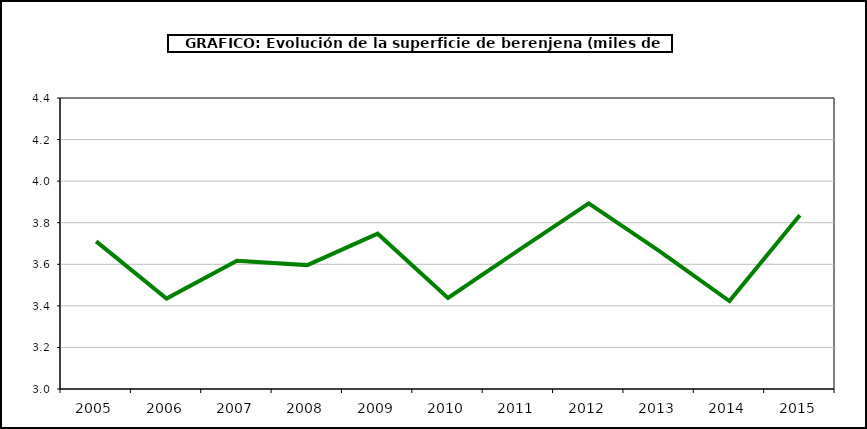
| Category | superficie |
|---|---|
| 2005.0 | 3.71 |
| 2006.0 | 3.435 |
| 2007.0 | 3.617 |
| 2008.0 | 3.596 |
| 2009.0 | 3.747 |
| 2010.0 | 3.438 |
| 2011.0 | 3.667 |
| 2012.0 | 3.893 |
| 2013.0 | 3.665 |
| 2014.0 | 3.423 |
| 2015.0 | 3.836 |